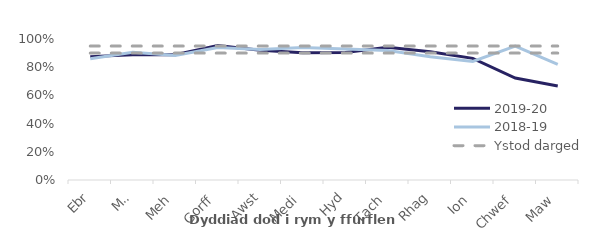
| Category | 2019-20 | 2018-19 | Ystod darged | Affin uchaf |
|---|---|---|---|---|
| Ebr | 0.875 | 0.86 | 0.9 | 0.95 |
| Mai | 0.889 | 0.907 | 0.9 | 0.95 |
| Meh | 0.889 | 0.883 | 0.9 | 0.95 |
| Gorff | 0.953 | 0.94 | 0.9 | 0.95 |
| Awst | 0.921 | 0.926 | 0.9 | 0.95 |
| Medi | 0.902 | 0.939 | 0.9 | 0.95 |
| Hyd | 0.904 | 0.929 | 0.9 | 0.95 |
| Tach | 0.942 | 0.919 | 0.9 | 0.95 |
| Rhag | 0.909 | 0.874 | 0.9 | 0.95 |
| Ion | 0.863 | 0.841 | 0.9 | 0.95 |
| Chwef | 0.723 | 0.95 | 0.9 | 0.95 |
| Maw | 0.667 | 0.819 | 0.9 | 0.95 |